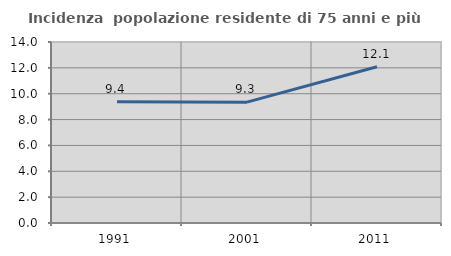
| Category | Incidenza  popolazione residente di 75 anni e più |
|---|---|
| 1991.0 | 9.375 |
| 2001.0 | 9.346 |
| 2011.0 | 12.085 |